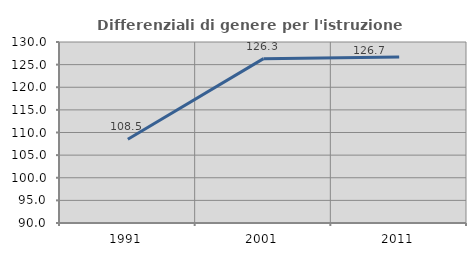
| Category | Differenziali di genere per l'istruzione superiore |
|---|---|
| 1991.0 | 108.519 |
| 2001.0 | 126.324 |
| 2011.0 | 126.667 |